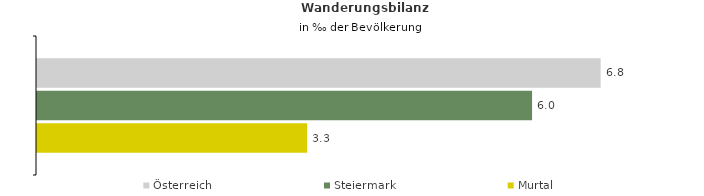
| Category | Österreich | Steiermark | Murtal |
|---|---|---|---|
| Wanderungsrate in ‰ der Bevölkerung, Periode 2018-2022 | 6.822 | 5.992 | 3.269 |